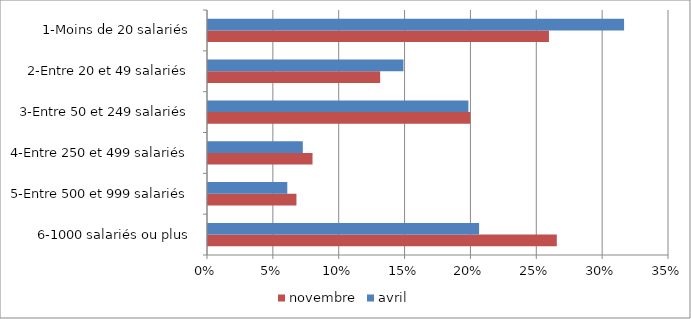
| Category | novembre | avril |
|---|---|---|
| 6-1000 salariés ou plus | 0.265 | 0.206 |
| 5-Entre 500 et 999 salariés | 0.067 | 0.06 |
| 4-Entre 250 et 499 salariés | 0.079 | 0.072 |
| 3-Entre 50 et 249 salariés | 0.199 | 0.198 |
| 2-Entre 20 et 49 salariés | 0.131 | 0.148 |
| 1-Moins de 20 salariés | 0.259 | 0.316 |